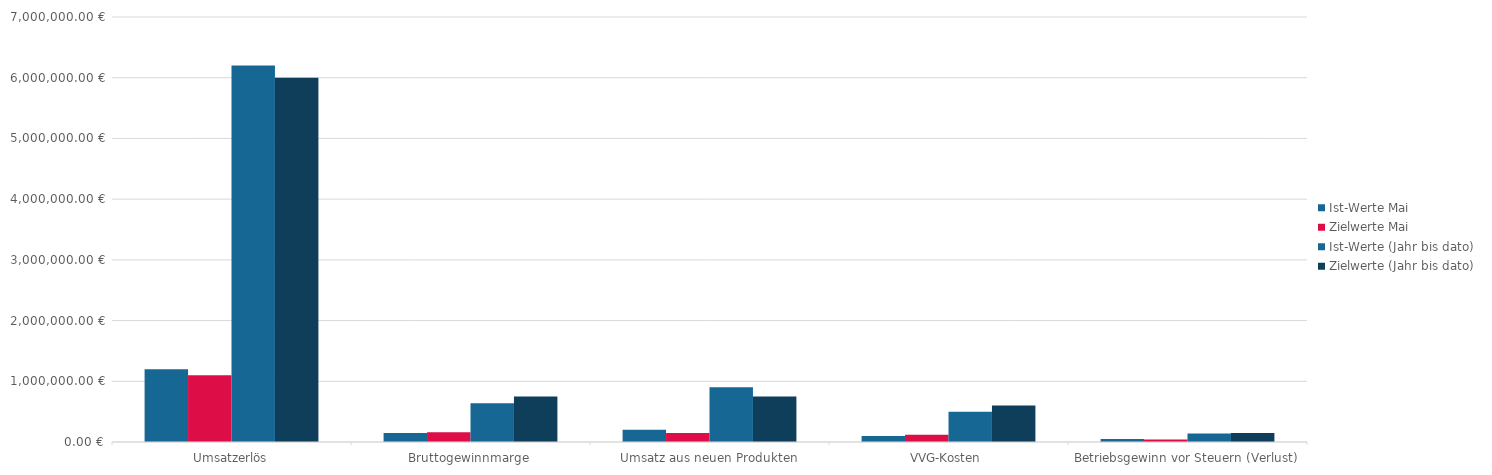
| Category | Ist-Werte Mai | Zielwerte Mai | Ist-Werte (Jahr bis dato) | Zielwerte (Jahr bis dato) |
|---|---|---|---|---|
| Umsatzerlös | 1200000 | 1100000 | 6200000 | 6000000 |
| Bruttogewinnmarge | 150000 | 160000 | 640000 | 750000 |
| Umsatz aus neuen Produkten | 200000 | 150000 | 900000 | 750000 |
| VVG-Kosten | 100000 | 120000 | 500000 | 600000 |
| Betriebsgewinn vor Steuern (Verlust) | 50000 | 40000 | 140000 | 150000 |